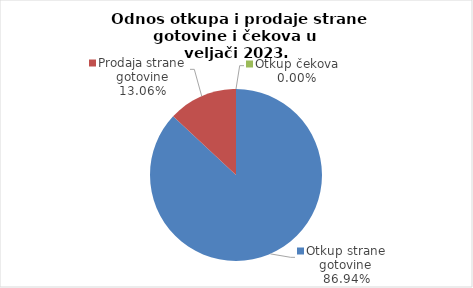
| Category | Series 0 |
|---|---|
| Otkup strane gotovine | 86.942 |
| Prodaja strane gotovine | 13.058 |
| Otkup čekova | 0 |